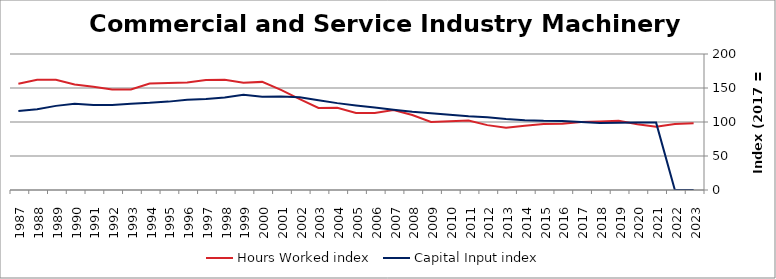
| Category | Hours Worked index | Capital Input index |
|---|---|---|
| 2023.0 | 98.129 | 0 |
| 2022.0 | 97.224 | 0 |
| 2021.0 | 92.922 | 99.086 |
| 2020.0 | 96.634 | 99.139 |
| 2019.0 | 101.759 | 98.987 |
| 2018.0 | 100.643 | 98.479 |
| 2017.0 | 100 | 100 |
| 2016.0 | 97.548 | 101.624 |
| 2015.0 | 97.084 | 101.798 |
| 2014.0 | 94.63 | 102.583 |
| 2013.0 | 91.573 | 104.431 |
| 2012.0 | 95.416 | 106.963 |
| 2011.0 | 102.101 | 108.407 |
| 2010.0 | 101.265 | 110.584 |
| 2009.0 | 100.156 | 112.94 |
| 2008.0 | 110.222 | 115.101 |
| 2007.0 | 117.577 | 118.147 |
| 2006.0 | 113.297 | 121.206 |
| 2005.0 | 113.218 | 124.222 |
| 2004.0 | 120.818 | 127.756 |
| 2003.0 | 120.654 | 132.141 |
| 2002.0 | 133.594 | 136.281 |
| 2001.0 | 147.271 | 137.405 |
| 2000.0 | 159.005 | 137.123 |
| 1999.0 | 157.682 | 140.015 |
| 1998.0 | 162.082 | 135.897 |
| 1997.0 | 161.904 | 133.853 |
| 1996.0 | 157.986 | 132.638 |
| 1995.0 | 157.296 | 129.969 |
| 1994.0 | 156.692 | 128.133 |
| 1993.0 | 147.749 | 126.95 |
| 1992.0 | 147.898 | 125.085 |
| 1991.0 | 151.978 | 124.953 |
| 1990.0 | 155.304 | 126.692 |
| 1989.0 | 162.037 | 123.719 |
| 1988.0 | 162.27 | 118.645 |
| 1987.0 | 156.293 | 116.161 |